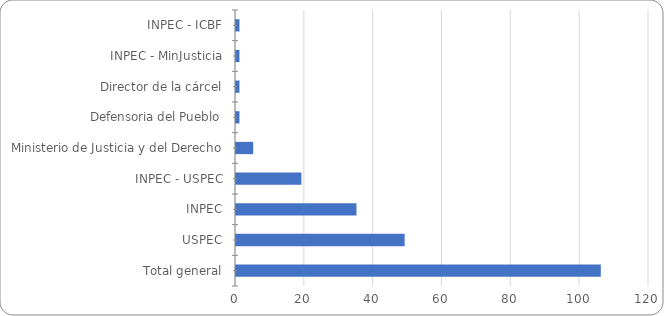
| Category | Recuento distinto de ESTANDAR (MINIMO CONSTITUCIONALMENTE ASEGURABLE) |
|---|---|
| INPEC - ICBF | 1 |
| INPEC - MinJusticia | 1 |
| Director de la cárcel | 1 |
| Defensoria del Pueblo | 1 |
| Ministerio de Justicia y del Derecho | 5 |
| INPEC - USPEC | 19 |
| INPEC | 35 |
| USPEC | 49 |
| Total general | 106 |